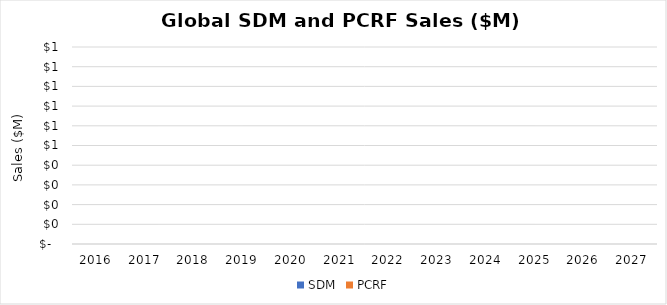
| Category | SDM | PCRF |
|---|---|---|
| 2016.0 | 0 | 0 |
| 2017.0 | 0 | 0 |
| 2018.0 | 0 | 0 |
| 2019.0 | 0 | 0 |
| 2020.0 | 0 | 0 |
| 2021.0 | 0 | 0 |
| 2022.0 | 0 | 0 |
| 2023.0 | 0 | 0 |
| 2024.0 | 0 | 0 |
| 2025.0 | 0 | 0 |
| 2026.0 | 0 | 0 |
| 2027.0 | 0 | 0 |